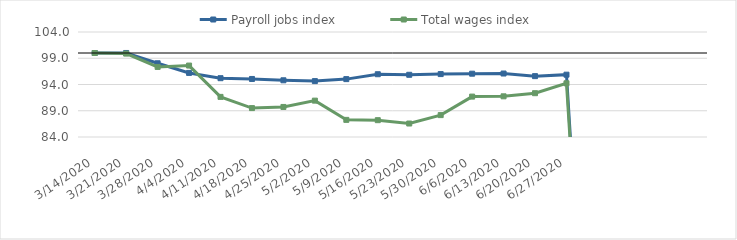
| Category | Payroll jobs index | Total wages index |
|---|---|---|
| 14/03/2020 | 100 | 100 |
| 21/03/2020 | 100.004 | 99.885 |
| 28/03/2020 | 98.043 | 97.347 |
| 04/04/2020 | 96.207 | 97.607 |
| 11/04/2020 | 95.202 | 91.642 |
| 18/04/2020 | 95.056 | 89.503 |
| 25/04/2020 | 94.803 | 89.725 |
| 02/05/2020 | 94.647 | 90.926 |
| 09/05/2020 | 95.025 | 87.264 |
| 16/05/2020 | 95.958 | 87.203 |
| 23/05/2020 | 95.849 | 86.568 |
| 30/05/2020 | 95.985 | 88.167 |
| 06/06/2020 | 96.058 | 91.694 |
| 13/06/2020 | 96.09 | 91.75 |
| 20/06/2020 | 95.594 | 92.342 |
| 27/06/2020 | 95.871 | 94.23 |